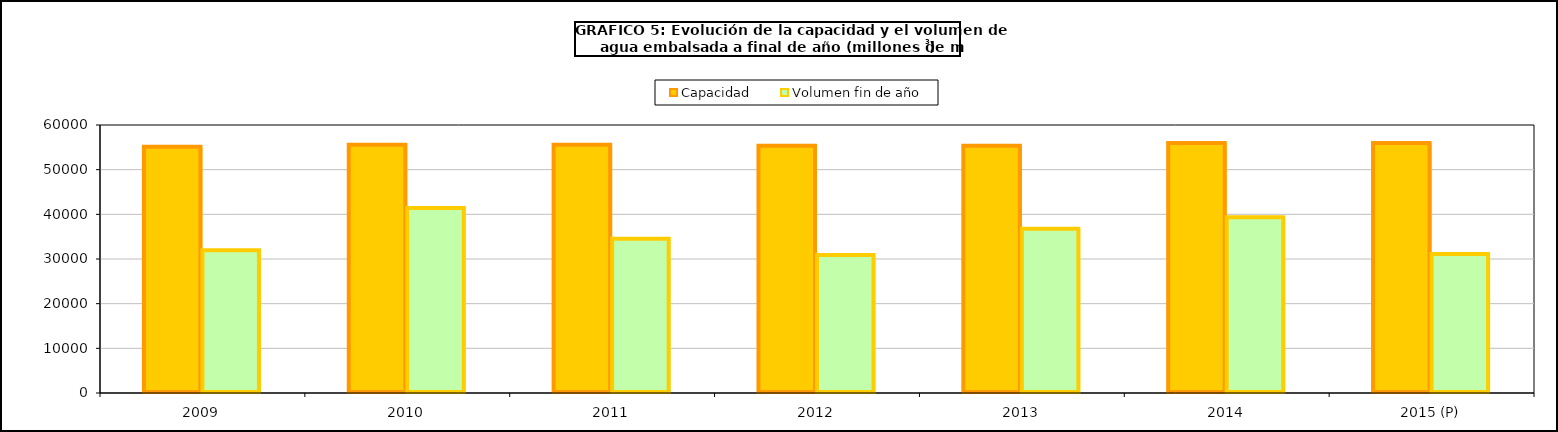
| Category | Capacidad | Volumen fin de año |
|---|---|---|
| 2009 | 55111 | 31945 |
| 2010 | 55586 | 41427 |
| 2011 | 55590 | 34536 |
| 2012 | 55327 | 30872 |
| 2013 | 55343 | 36761 |
| 2014 | 55977 | 39350 |
| 2015 (P) | 55977 | 31121 |